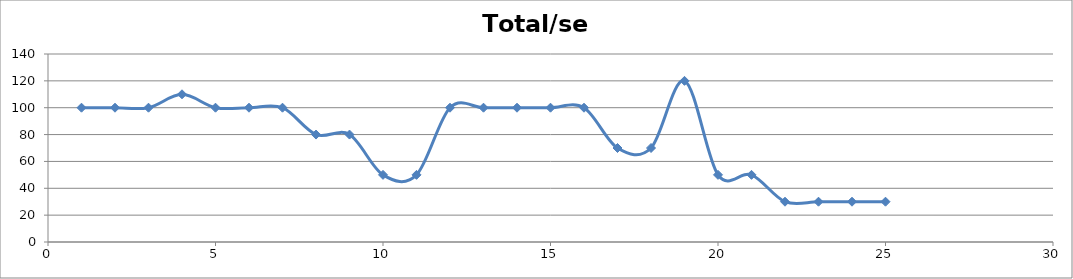
| Category | Total/sem |
|---|---|
| 1.0 | 100 |
| 2.0 | 100 |
| 3.0 | 100 |
| 4.0 | 110 |
| 5.0 | 100 |
| 6.0 | 100 |
| 7.0 | 100 |
| 8.0 | 80 |
| 9.0 | 80 |
| 10.0 | 50 |
| 11.0 | 50 |
| 12.0 | 100 |
| 13.0 | 100 |
| 14.0 | 100 |
| 15.0 | 100 |
| 16.0 | 100 |
| 17.0 | 70 |
| 18.0 | 70 |
| 19.0 | 120 |
| 20.0 | 50 |
| 21.0 | 50 |
| 22.0 | 30 |
| 23.0 | 30 |
| 24.0 | 30 |
| 25.0 | 30 |